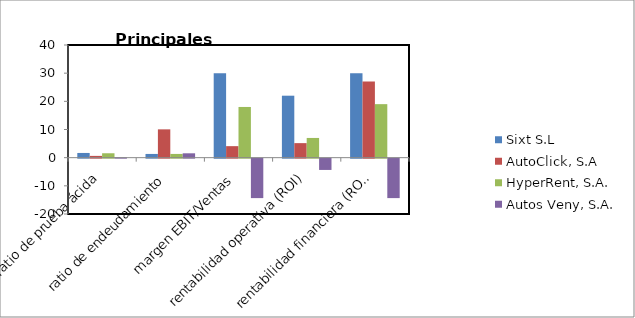
| Category | Sixt S.L | AutoClick, S.A | HyperRent, S.A. | Autos Veny, S.A. |
|---|---|---|---|---|
| ratio de prueba ácida | 1.671 | 0.63 | 1.566 | 0.13 |
| ratio de endeudamiento | 1.321 | 10.051 | 1.325 | 1.55 |
| margen EBIT/Ventas | 30 | 4.088 | 18 | -14 |
| rentabilidad operativa (ROI) | 22 | 5.16 | 7 | -4 |
| rentabilidad financiera (ROE) | 30 | 27 | 19 | -14 |